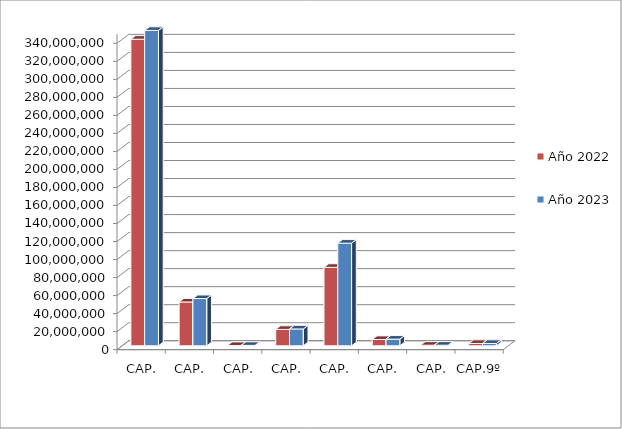
| Category | Año 2022 | Año 2023 |
|---|---|---|
| CAP. 1º | 340256899.874 | 369100682.58 |
| CAP. 2º | 48641131.557 | 52413815.85 |
| CAP. 3º | 337000 | 455000 |
| CAP. 4º | 18192508.704 | 18711128.727 |
| CAP. 6º | 87066708.68 | 113907545.366 |
| CAP. 7º | 7026819.03 | 7394466.311 |
| CAP. 8º | 650000 | 650000 |
| CAP.9º | 2600000 | 2600000 |